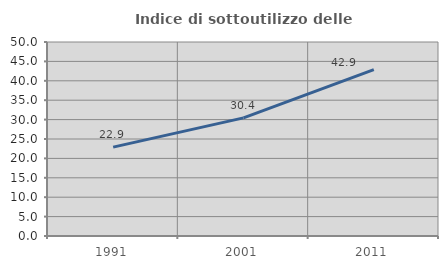
| Category | Indice di sottoutilizzo delle abitazioni  |
|---|---|
| 1991.0 | 22.912 |
| 2001.0 | 30.443 |
| 2011.0 | 42.883 |